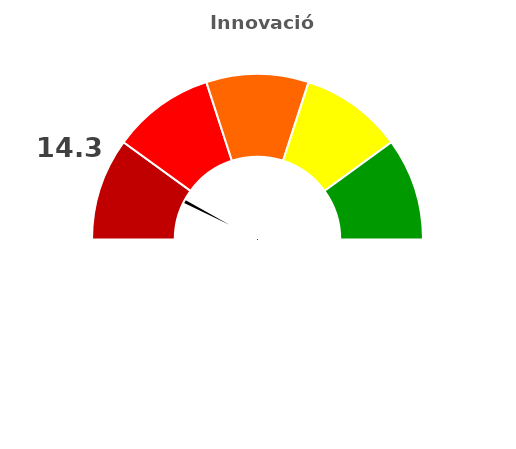
| Category | refe |
|---|---|
| 0 | 14.3 |
| 1 | 2 |
| 2 | 183.7 |